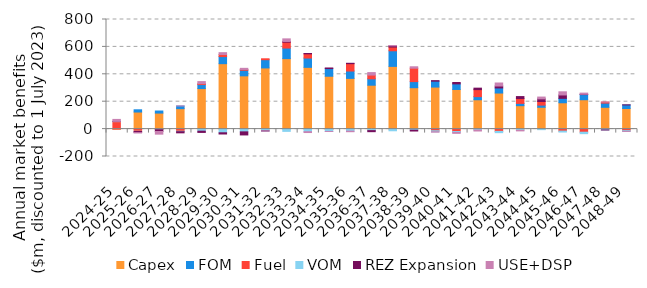
| Category | Capex | FOM | Fuel | VOM | REZ Expansion | USE+DSP |
|---|---|---|---|---|---|---|
| 2024-25 | 0 | 0 | 54.41 | 1.562 | 0.503 | 14.251 |
| 2025-26 | 124.58 | 16.338 | -15.752 | -1.881 | -8.033 | -1.51 |
| 2026-27 | 116.904 | 15.065 | -3.424 | -0.986 | -13.157 | -19.292 |
| 2027-28 | 149.158 | 19.431 | -15.577 | -3.433 | -8.261 | 0.369 |
| 2028-29 | 295.759 | 29.363 | 6.395 | -15.109 | -9.192 | 15.216 |
| 2029-30 | 477.569 | 51.817 | 14.775 | -26.951 | -8.791 | 13.769 |
| 2030-31 | 388.801 | 40.673 | 5.85 | -20.162 | -22.458 | 8.191 |
| 2031-32 | 446.546 | 59.998 | 6.692 | -12.827 | -0.748 | -0.021 |
| 2032-33 | 514.474 | 77.164 | 42.928 | -16.627 | 5.231 | 18.837 |
| 2033-34 | 450.778 | 67.932 | 30.681 | -19.129 | 2.356 | -5.994 |
| 2034-35 | 385.839 | 55.793 | -1.637 | -15.264 | 4.519 | -0.216 |
| 2035-36 | 370.126 | 53.69 | 53.889 | -14.585 | 2.692 | -4.385 |
| 2036-37 | 320.367 | 46.678 | 27.324 | -11.055 | -7.776 | 18.104 |
| 2037-38 | 457.774 | 113.925 | 27.296 | -12.206 | 8.795 | 2.542 |
| 2038-39 | 302.274 | 44.48 | 97.715 | -7.786 | -6.187 | 10.428 |
| 2039-40 | 306.752 | 42.999 | -12.036 | -7.26 | 3.884 | -2.958 |
| 2040-41 | 289.365 | 40.711 | -17.408 | -6.777 | 9.969 | -6.872 |
| 2041-42 | 214.137 | 22.792 | 51.229 | -6.696 | 10.698 | -7.147 |
| 2042-43 | 263.254 | 37.133 | -16.573 | -9.485 | 14.09 | 22.029 |
| 2043-44 | 170.982 | 16.668 | 35.341 | -8.844 | 14.409 | -4.156 |
| 2044-45 | 159.345 | 15.533 | 26.482 | -3.992 | 19.34 | 13.114 |
| 2045-46 | 192.158 | 32.313 | -14.684 | -6.745 | 24.656 | 23.051 |
| 2046-47 | 214.256 | 37.666 | -22.666 | -10.663 | 2.452 | 8.331 |
| 2047-48 | 159.101 | 30.747 | 7.37 | -6.084 | -0.362 | 0.457 |
| 2048-49 | 150.559 | 25.826 | -11.324 | -5.367 | 0.313 | -0.096 |